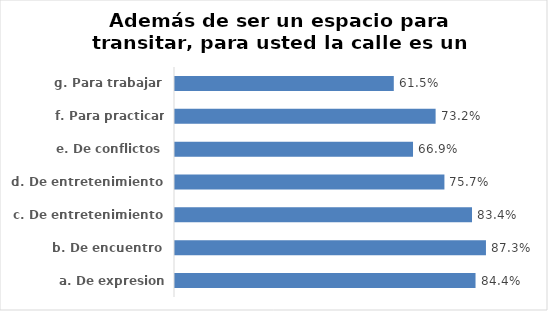
| Category | Series 0 |
|---|---|
| a. De expresion cultural | 0.844 |
| b. De encuentro | 0.873 |
| c. De entretenimiento | 0.834 |
| d. De entretenimiento | 0.757 |
| e. De conflictos | 0.669 |
| f. Para practicar deportes | 0.732 |
| g. Para trabajar | 0.615 |